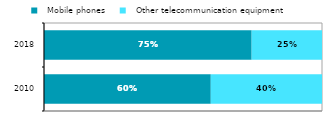
| Category |   Mobile phones |   Other telecommunication equipment |
|---|---|---|
| 2010.0 | 0.6 | 0.4 |
| 2018.0 | 0.747 | 0.253 |